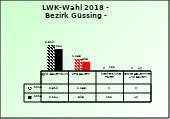
| Category | 2013 | 2018 |
|---|---|---|
| Bgld. Bauernbund | 2519 | 2124 |
| SPÖ Bauern | 1185 | 895 |
| Freiheitliche Partei | 0 | 122 |
| Grüne Bäuerinnen und Bauern | 0 | 46 |